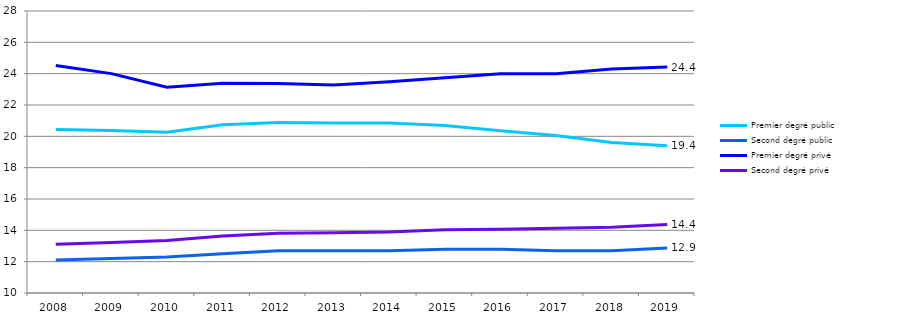
| Category | Premier degré public | Second degré public | Premier degré privé | Second degré privé |
|---|---|---|---|---|
| 2008.0 | 20.443 | 12.1 | 24.517 | 13.105 |
| 2009.0 | 20.377 | 12.2 | 24.003 | 13.227 |
| 2010.0 | 20.263 | 12.3 | 23.14 | 13.352 |
| 2011.0 | 20.743 | 12.5 | 23.382 | 13.635 |
| 2012.0 | 20.882 | 12.7 | 23.369 | 13.813 |
| 2013.0 | 20.844 | 12.7 | 23.284 | 13.841 |
| 2014.0 | 20.847 | 12.7 | 23.477 | 13.893 |
| 2015.0 | 20.687 | 12.8 | 23.741 | 14.035 |
| 2016.0 | 20.363 | 12.8 | 23.992 | 14.068 |
| 2017.0 | 20.053 | 12.7 | 23.994 | 14.14 |
| 2018.0 | 19.6 | 12.7 | 24.3 | 14.2 |
| 2019.0 | 19.393 | 12.874 | 24.422 | 14.365 |